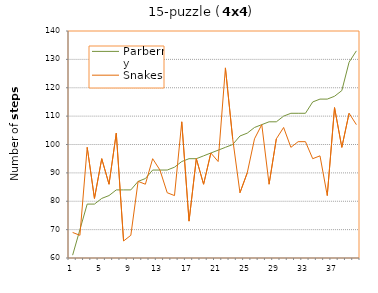
| Category | Parberry | Snakes |
|---|---|---|
| 0 | 61 | 69 |
| 1 | 70 | 68 |
| 2 | 79 | 99 |
| 3 | 79 | 81 |
| 4 | 81 | 95 |
| 5 | 82 | 86 |
| 6 | 84 | 104 |
| 7 | 84 | 66 |
| 8 | 84 | 68 |
| 9 | 87 | 87 |
| 10 | 88 | 86 |
| 11 | 91 | 95 |
| 12 | 91 | 91 |
| 13 | 91 | 83 |
| 14 | 92 | 82 |
| 15 | 94 | 108 |
| 16 | 95 | 73 |
| 17 | 95 | 95 |
| 18 | 96 | 86 |
| 19 | 97 | 97 |
| 20 | 98 | 94 |
| 21 | 99 | 127 |
| 22 | 100 | 102 |
| 23 | 103 | 83 |
| 24 | 104 | 90 |
| 25 | 106 | 102 |
| 26 | 107 | 107 |
| 27 | 108 | 86 |
| 28 | 108 | 102 |
| 29 | 110 | 106 |
| 30 | 111 | 99 |
| 31 | 111 | 101 |
| 32 | 111 | 101 |
| 33 | 115 | 95 |
| 34 | 116 | 96 |
| 35 | 116 | 82 |
| 36 | 117 | 113 |
| 37 | 119 | 99 |
| 38 | 129 | 111 |
| 39 | 133 | 107 |